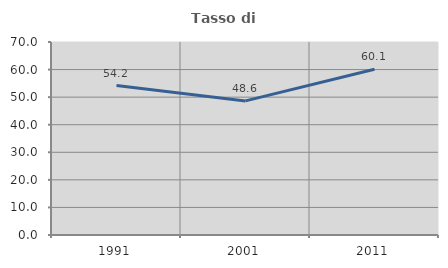
| Category | Tasso di occupazione   |
|---|---|
| 1991.0 | 54.209 |
| 2001.0 | 48.639 |
| 2011.0 | 60.123 |